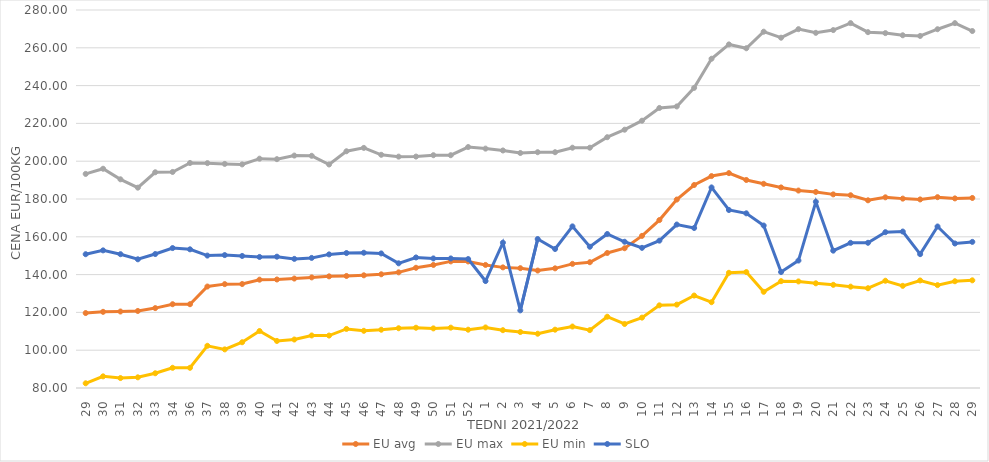
| Category | EU avg | EU max | EU min | SLO |
|---|---|---|---|---|
| 29.0 | 119.659 | 193.272 | 82.49 | 150.79 |
| 30.0 | 120.3 | 196.01 | 86.16 | 152.82 |
| 31.0 | 120.473 | 190.42 | 85.26 | 150.8 |
| 32.0 | 120.756 | 186 | 85.65 | 148.1 |
| 33.0 | 122.274 | 194.145 | 87.8 | 150.88 |
| 34.0 | 124.332 | 194.304 | 90.69 | 154.04 |
| 36.0 | 124.332 | 199.06 | 90.69 | 153.37 |
| 37.0 | 133.685 | 198.97 | 102.334 | 150.06 |
| 38.0 | 134.959 | 198.57 | 100.43 | 150.32 |
| 39.0 | 135.021 | 198.3 | 104.21 | 149.86 |
| 40.0 | 137.315 | 201.34 | 110.15 | 149.34 |
| 41.0 | 137.411 | 201.081 | 104.9 | 149.48 |
| 42.0 | 137.908 | 202.98 | 105.65 | 148.32 |
| 43.0 | 138.52 | 202.856 | 107.8 | 148.83 |
| 44.0 | 139.076 | 198.26 | 107.75 | 150.69 |
| 45.0 | 139.275 | 205.257 | 111.25 | 151.41 |
| 46.0 | 139.626 | 207.046 | 110.26 | 151.56 |
| 47.0 | 140.17 | 203.387 | 110.83 | 151.2 |
| 48.0 | 141.2 | 202.42 | 111.62 | 145.97 |
| 49.0 | 143.614 | 202.45 | 111.89 | 149.07 |
| 50.0 | 145.101 | 203.17 | 111.54 | 148.55 |
| 51.0 | 146.984 | 203.17 | 111.93 | 148.54 |
| 52.0 | 146.958 | 207.5 | 110.85 | 148.22 |
| 1.0 | 145.11 | 206.66 | 112.04 | 136.59 |
| 2.0 | 143.822 | 205.67 | 110.59 | 156.88 |
| 3.0 | 143.402 | 204.34 | 109.62 | 121.07 |
| 4.0 | 142.134 | 204.76 | 108.71 | 158.82 |
| 5.0 | 143.314 | 204.76 | 110.86 | 153.55 |
| 6.0 | 145.677 | 207.14 | 112.52 | 165.51 |
| 7.0 | 146.556 | 207.14 | 110.619 | 154.74 |
| 8.0 | 151.439 | 212.7 | 117.709 | 161.48 |
| 9.0 | 153.947 | 216.67 | 113.871 | 157.38 |
| 10.0 | 160.496 | 221.43 | 117.233 | 154.16 |
| 11.0 | 168.845 | 228.17 | 123.737 | 157.96 |
| 12.0 | 179.714 | 228.97 | 124.105 | 166.49 |
| 13.0 | 187.409 | 238.81 | 128.918 | 164.66 |
| 14.0 | 192.137 | 254.21 | 125.399 | 186.11 |
| 15.0 | 193.697 | 261.79 | 140.954 | 174.18 |
| 16.0 | 190.066 | 259.76 | 141.337 | 172.42 |
| 17.0 | 188.031 | 268.52 | 130.897 | 165.96 |
| 18.0 | 186.119 | 265.34 | 136.529 | 141.36 |
| 19.0 | 184.47 | 269.87 | 136.387 | 147.43 |
| 20.0 | 183.734 | 267.92 | 135.392 | 178.51 |
| 21.0 | 182.45 | 269.38 | 134.589 | 152.67 |
| 22.0 | 181.991 | 273.06 | 133.621 | 156.8 |
| 23.0 | 179.308 | 268.27 | 132.787 | 156.84 |
| 24.0 | 180.886 | 267.77 | 136.75 | 162.44 |
| 25.0 | 180.2 | 266.63 | 134.058 | 162.78 |
| 26.0 | 179.77 | 266.27 | 136.895 | 150.82 |
| 27.0 | 180.967 | 269.83 | 134.44 | 165.45 |
| 28.0 | 180.319 | 273.05 | 136.486 | 156.46 |
| 29.0 | 180.553 | 268.87 | 136.97 | 157.31 |